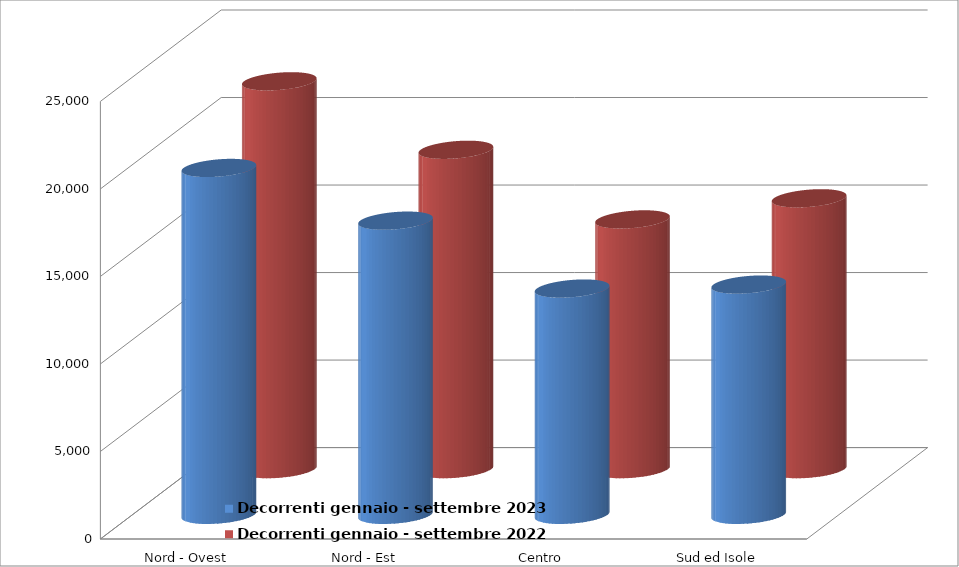
| Category | Decorrenti gennaio - settembre 2023 | Decorrenti gennaio - settembre 2022 |
|---|---|---|
| Nord - Ovest | 19819 | 22159 |
| Nord - Est | 16808 | 18246 |
| Centro | 12929 | 14269 |
| Sud ed Isole | 13156 | 15475 |